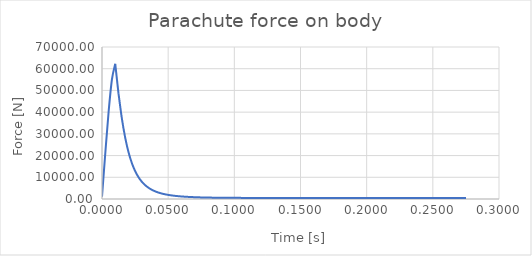
| Category | Series 0 |
|---|---|
| 0.0 | 1073.285 |
| 0.0025 | 21190.134 |
| 0.005 | 40176.817 |
| 0.0075 | 55033.483 |
| 0.01 | 62262.936 |
| 0.0125 | 48454.191 |
| 0.015000000000000001 | 37143.418 |
| 0.0175 | 28324.856 |
| 0.02 | 21638.375 |
| 0.0225 | 16635.526 |
| 0.024999999999999998 | 12906.562 |
| 0.027499999999999997 | 10121.03 |
| 0.029999999999999995 | 8028.139 |
| 0.032499999999999994 | 6443.255 |
| 0.034999999999999996 | 5232.319 |
| 0.0375 | 4298.415 |
| 0.04 | 3571.382 |
| 0.0425 | 3000.193 |
| 0.045000000000000005 | 2547.481 |
| 0.04750000000000001 | 2185.673 |
| 0.05000000000000001 | 1894.244 |
| 0.05250000000000001 | 1657.791 |
| 0.055000000000000014 | 1464.646 |
| 0.057500000000000016 | 1305.901 |
| 0.06000000000000002 | 1174.695 |
| 0.06250000000000001 | 1065.702 |
| 0.06500000000000002 | 974.754 |
| 0.06750000000000002 | 898.564 |
| 0.07000000000000002 | 834.522 |
| 0.07250000000000002 | 780.538 |
| 0.07500000000000002 | 734.93 |
| 0.07750000000000003 | 696.331 |
| 0.08000000000000003 | 663.625 |
| 0.08250000000000003 | 635.893 |
| 0.08500000000000003 | 612.376 |
| 0.08750000000000004 | 592.439 |
| 0.09000000000000004 | 575.551 |
| 0.09250000000000004 | 561.264 |
| 0.09500000000000004 | 549.199 |
| 0.09750000000000004 | 539.031 |
| 0.10000000000000005 | 530.483 |
| 0.10250000000000005 | 523.318 |
| 0.10500000000000005 | 517.332 |
| 0.10750000000000005 | 512.348 |
| 0.11000000000000006 | 508.214 |
| 0.11250000000000006 | 504.799 |
| 0.11500000000000006 | 501.99 |
| 0.11750000000000006 | 499.69 |
| 0.12000000000000006 | 497.816 |
| 0.12250000000000007 | 496.295 |
| 0.12500000000000006 | 495.068 |
| 0.12750000000000006 | 494.083 |
| 0.13000000000000006 | 493.297 |
| 0.13250000000000006 | 492.672 |
| 0.13500000000000006 | 492.178 |
| 0.13750000000000007 | 491.79 |
| 0.14000000000000007 | 491.486 |
| 0.14250000000000007 | 491.251 |
| 0.14500000000000007 | 491.069 |
| 0.14750000000000008 | 490.929 |
| 0.15000000000000008 | 490.822 |
| 0.15250000000000008 | 490.741 |
| 0.15500000000000008 | 490.68 |
| 0.15750000000000008 | 490.634 |
| 0.1600000000000001 | 490.599 |
| 0.1625000000000001 | 490.574 |
| 0.1650000000000001 | 490.555 |
| 0.1675000000000001 | 490.541 |
| 0.1700000000000001 | 490.531 |
| 0.1725000000000001 | 490.524 |
| 0.1750000000000001 | 490.519 |
| 0.1775000000000001 | 490.515 |
| 0.1800000000000001 | 490.512 |
| 0.1825000000000001 | 490.51 |
| 0.1850000000000001 | 490.509 |
| 0.1875000000000001 | 490.508 |
| 0.1900000000000001 | 490.507 |
| 0.19250000000000012 | 490.507 |
| 0.19500000000000012 | 490.506 |
| 0.19750000000000012 | 490.506 |
| 0.20000000000000012 | 490.506 |
| 0.20250000000000012 | 490.506 |
| 0.20500000000000013 | 490.505 |
| 0.20750000000000013 | 490.505 |
| 0.21000000000000013 | 490.505 |
| 0.21250000000000013 | 490.505 |
| 0.21500000000000014 | 490.505 |
| 0.21750000000000014 | 490.505 |
| 0.22000000000000014 | 490.505 |
| 0.22250000000000014 | 490.505 |
| 0.22500000000000014 | 490.505 |
| 0.22750000000000015 | 490.505 |
| 0.23000000000000015 | 490.505 |
| 0.23250000000000015 | 490.505 |
| 0.23500000000000015 | 490.505 |
| 0.23750000000000016 | 490.505 |
| 0.24000000000000016 | 490.504 |
| 0.24250000000000016 | 490.504 |
| 0.24500000000000016 | 490.504 |
| 0.24750000000000016 | 490.504 |
| 0.25000000000000017 | 490.504 |
| 0.25250000000000017 | 490.504 |
| 0.25500000000000017 | 490.504 |
| 0.2575000000000002 | 490.504 |
| 0.2600000000000002 | 490.504 |
| 0.2625000000000002 | 490.504 |
| 0.2650000000000002 | 490.504 |
| 0.2675000000000002 | 490.504 |
| 0.2700000000000002 | 490.504 |
| 0.2725000000000002 | 490.504 |
| 0.2750000000000002 | 490.504 |